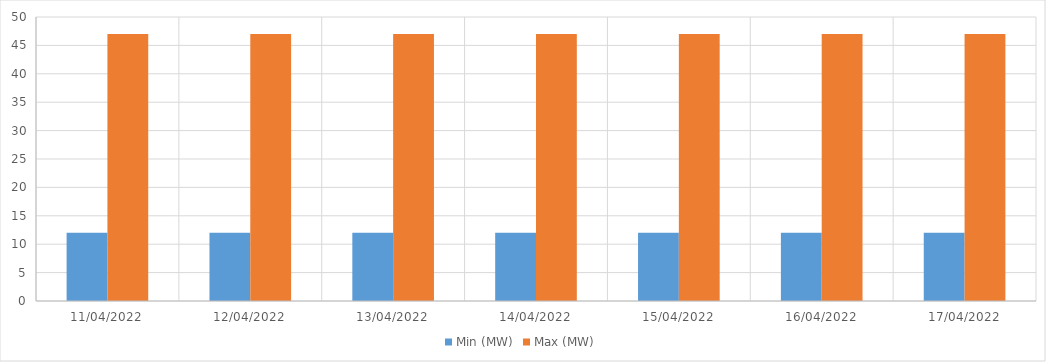
| Category | Min (MW) | Max (MW) |
|---|---|---|
| 11/04/2022 | 12 | 47 |
| 12/04/2022 | 12 | 47 |
| 13/04/2022 | 12 | 47 |
| 14/04/2022 | 12 | 47 |
| 15/04/2022 | 12 | 47 |
| 16/04/2022 | 12 | 47 |
| 17/04/2022 | 12 | 47 |